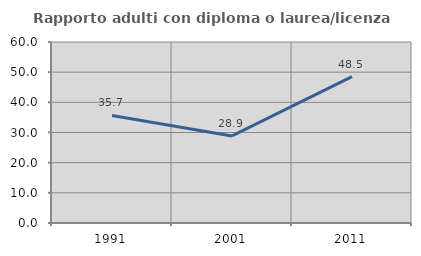
| Category | Rapporto adulti con diploma o laurea/licenza media  |
|---|---|
| 1991.0 | 35.661 |
| 2001.0 | 28.868 |
| 2011.0 | 48.545 |